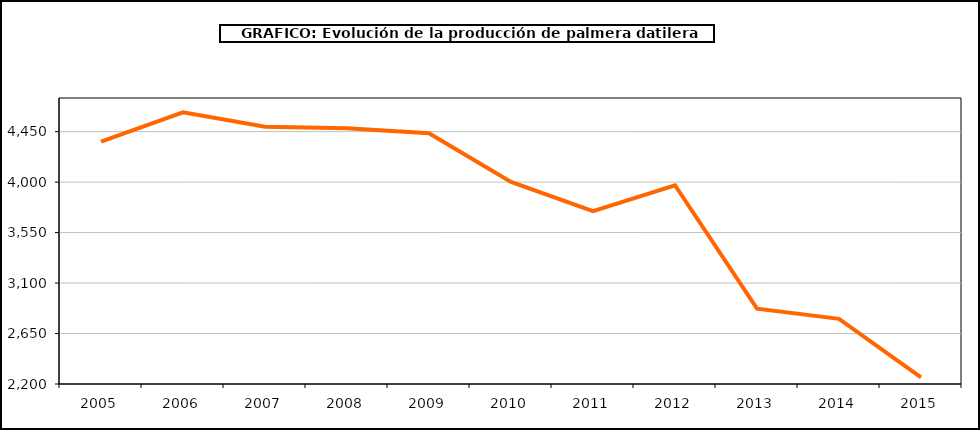
| Category | producción kiwi |
|---|---|
| 2005.0 | 4360 |
| 2006.0 | 4622 |
| 2007.0 | 4494 |
| 2008.0 | 4481 |
| 2009.0 | 4435 |
| 2010.0 | 4002 |
| 2011.0 | 3741 |
| 2012.0 | 3972 |
| 2013.0 | 2872 |
| 2014.0 | 2781 |
| 2015.0 | 2260 |